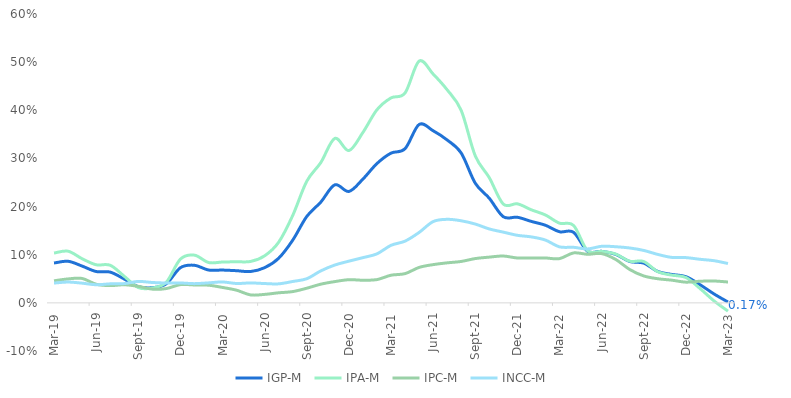
| Category | IGP-M | IPA-M | IPC-M | INCC-M |
|---|---|---|---|---|
| 2019-03-01 | 0.083 | 0.103 | 0.046 | 0.041 |
| 2019-04-01 | 0.086 | 0.107 | 0.05 | 0.043 |
| 2019-05-01 | 0.076 | 0.092 | 0.051 | 0.041 |
| 2019-06-01 | 0.065 | 0.079 | 0.039 | 0.038 |
| 2019-07-01 | 0.064 | 0.078 | 0.036 | 0.04 |
| 2019-08-01 | 0.05 | 0.055 | 0.038 | 0.04 |
| 2019-09-01 | 0.034 | 0.032 | 0.034 | 0.044 |
| 2019-10-01 | 0.032 | 0.031 | 0.028 | 0.042 |
| 2019-11-01 | 0.04 | 0.043 | 0.03 | 0.041 |
| 2019-12-01 | 0.073 | 0.091 | 0.038 | 0.041 |
| 2020-01-01 | 0.078 | 0.099 | 0.037 | 0.04 |
| 2020-02-01 | 0.068 | 0.084 | 0.037 | 0.042 |
| 2020-03-01 | 0.068 | 0.085 | 0.032 | 0.043 |
| 2020-04-01 | 0.067 | 0.085 | 0.026 | 0.04 |
| 2020-05-01 | 0.065 | 0.086 | 0.016 | 0.041 |
| 2020-06-01 | 0.073 | 0.098 | 0.018 | 0.04 |
| 2020-07-01 | 0.093 | 0.126 | 0.021 | 0.04 |
| 2020-08-01 | 0.13 | 0.182 | 0.023 | 0.044 |
| 2020-09-01 | 0.179 | 0.253 | 0.03 | 0.05 |
| 2020-10-01 | 0.209 | 0.291 | 0.039 | 0.066 |
| 2020-11-01 | 0.245 | 0.342 | 0.044 | 0.079 |
| 2020-12-01 | 0.231 | 0.316 | 0.048 | 0.087 |
| 2021-01-01 | 0.257 | 0.354 | 0.047 | 0.094 |
| 2021-02-01 | 0.289 | 0.401 | 0.048 | 0.102 |
| 2021-03-01 | 0.311 | 0.426 | 0.057 | 0.12 |
| 2021-04-01 | 0.32 | 0.436 | 0.061 | 0.128 |
| 2021-05-01 | 0.37 | 0.502 | 0.074 | 0.146 |
| 2021-06-01 | 0.358 | 0.475 | 0.079 | 0.169 |
| 2021-07-01 | 0.338 | 0.442 | 0.083 | 0.174 |
| 2021-08-01 | 0.311 | 0.4 | 0.086 | 0.17 |
| 2021-09-01 | 0.249 | 0.305 | 0.092 | 0.164 |
| 2021-10-01 | 0.217 | 0.26 | 0.095 | 0.154 |
| 2021-11-01 | 0.179 | 0.205 | 0.097 | 0.147 |
| 2021-12-01 | 0.178 | 0.206 | 0.093 | 0.14 |
| 2022-01-01 | 0.169 | 0.193 | 0.093 | 0.137 |
| 2022-02-01 | 0.161 | 0.182 | 0.093 | 0.13 |
| 2022-03-01 | 0.148 | 0.166 | 0.092 | 0.116 |
| 2022-04-01 | 0.147 | 0.161 | 0.104 | 0.115 |
| 2022-05-01 | 0.107 | 0.108 | 0.101 | 0.112 |
| 2022-06-01 | 0.107 | 0.107 | 0.102 | 0.118 |
| 2022-07-01 | 0.101 | 0.101 | 0.09 | 0.117 |
| 2022-08-01 | 0.086 | 0.086 | 0.069 | 0.114 |
| 2022-09-01 | 0.082 | 0.086 | 0.056 | 0.109 |
| 2022-10-01 | 0.065 | 0.065 | 0.05 | 0.101 |
| 2022-11-01 | 0.059 | 0.058 | 0.047 | 0.094 |
| 2022-12-01 | 0.054 | 0.053 | 0.043 | 0.094 |
| 2023-01-01 | 0.038 | 0.03 | 0.045 | 0.09 |
| 2023-02-01 | 0.019 | 0.004 | 0.045 | 0.088 |
| 2023-03-01 | 0.002 | -0.017 | 0.043 | 0.082 |